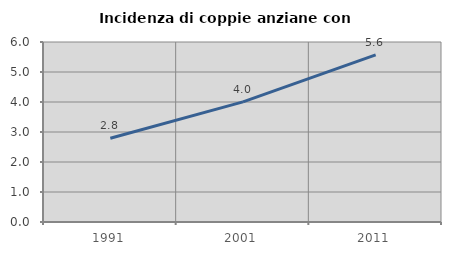
| Category | Incidenza di coppie anziane con figli |
|---|---|
| 1991.0 | 2.792 |
| 2001.0 | 4.004 |
| 2011.0 | 5.571 |